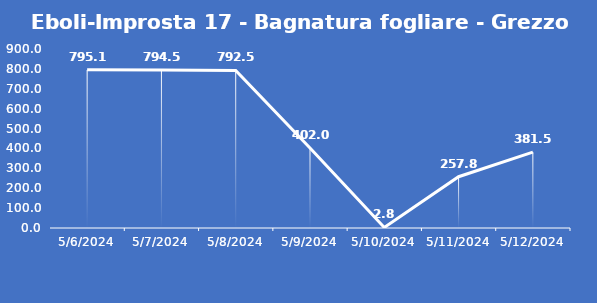
| Category | Eboli-Improsta 17 - Bagnatura fogliare - Grezzo (min) |
|---|---|
| 5/6/24 | 795.1 |
| 5/7/24 | 794.5 |
| 5/8/24 | 792.5 |
| 5/9/24 | 402 |
| 5/10/24 | 2.8 |
| 5/11/24 | 257.8 |
| 5/12/24 | 381.5 |